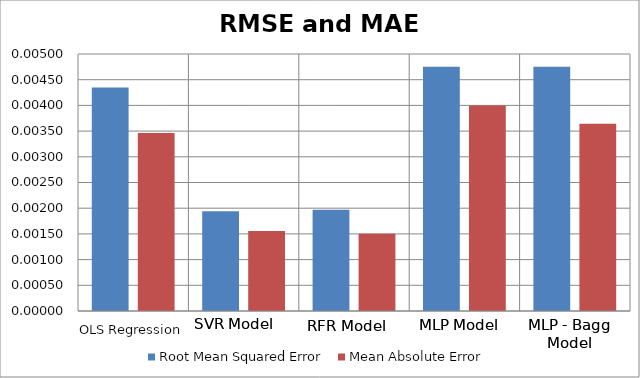
| Category | Root Mean Squared Error | Mean Absolute Error |
|---|---|---|
| 0 | 0.004 | 0.003 |
| 1 | 0.002 | 0.002 |
| 2 | 0.002 | 0.002 |
| 3 | 0.005 | 0.004 |
| 4 | 0.005 | 0.004 |